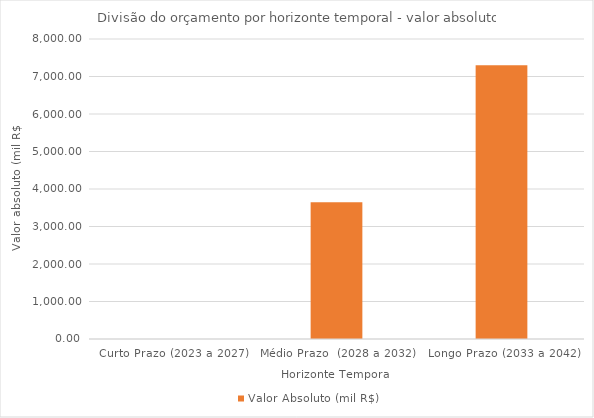
| Category | Valor Absoluto (mil R$) |
|---|---|
| Curto Prazo (2023 a 2027) | 0 |
| Médio Prazo  (2028 a 2032) | 3650 |
| Longo Prazo (2033 a 2042) | 7300 |